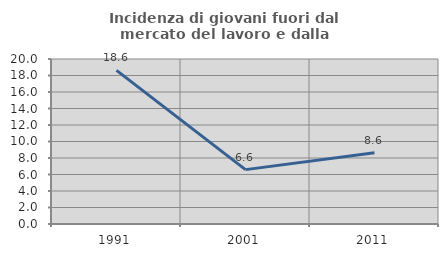
| Category | Incidenza di giovani fuori dal mercato del lavoro e dalla formazione  |
|---|---|
| 1991.0 | 18.627 |
| 2001.0 | 6.59 |
| 2011.0 | 8.627 |